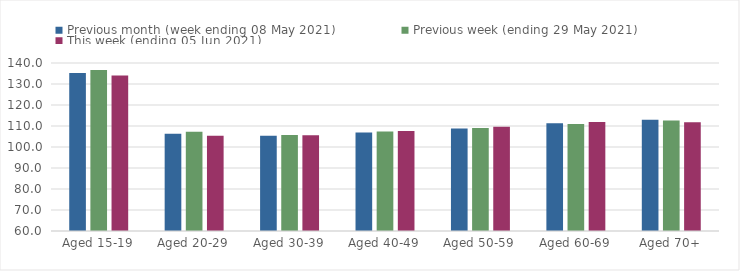
| Category | Previous month (week ending 08 May 2021) | Previous week (ending 29 May 2021) | This week (ending 05 Jun 2021) |
|---|---|---|---|
| Aged 15-19 | 135.27 | 136.68 | 134 |
| Aged 20-29 | 106.26 | 107.26 | 105.39 |
| Aged 30-39 | 105.36 | 105.77 | 105.64 |
| Aged 40-49 | 106.91 | 107.4 | 107.66 |
| Aged 50-59 | 108.79 | 108.99 | 109.62 |
| Aged 60-69 | 111.29 | 110.99 | 111.95 |
| Aged 70+ | 112.94 | 112.62 | 111.78 |